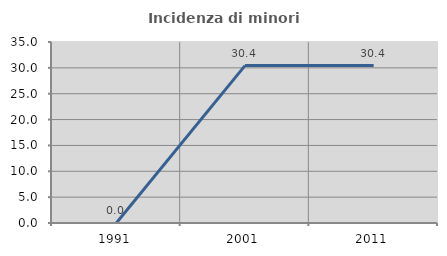
| Category | Incidenza di minori stranieri |
|---|---|
| 1991.0 | 0 |
| 2001.0 | 30.435 |
| 2011.0 | 30.435 |